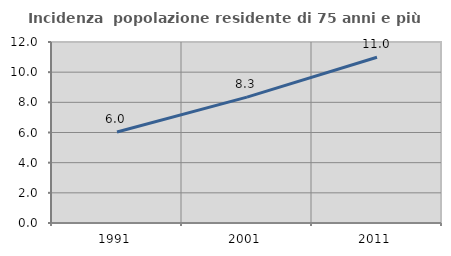
| Category | Incidenza  popolazione residente di 75 anni e più |
|---|---|
| 1991.0 | 6.029 |
| 2001.0 | 8.344 |
| 2011.0 | 10.986 |